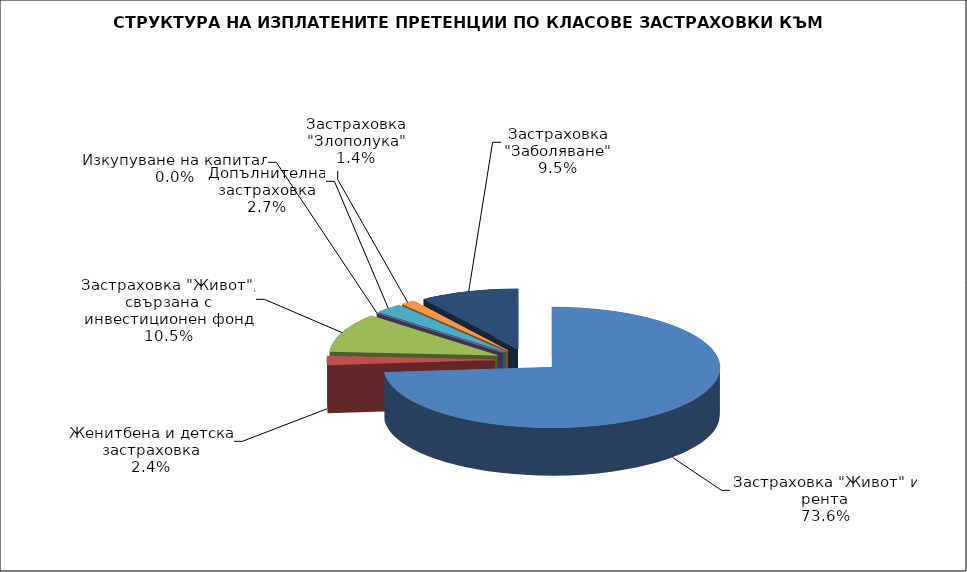
| Category | 106 324 619 |
|---|---|
| Застраховка "Живот" и рента | 106324619.476 |
| Женитбена и детска застраховка | 3405889.013 |
| Застраховка "Живот", свързана с инвестиционен фонд | 15126670.422 |
| Изкупуване на капитал | 0 |
| Допълнителна застраховка | 3847778.187 |
| Застраховка "Злополука" | 1993555.68 |
| Застраховка "Заболяване" | 13719081.767 |